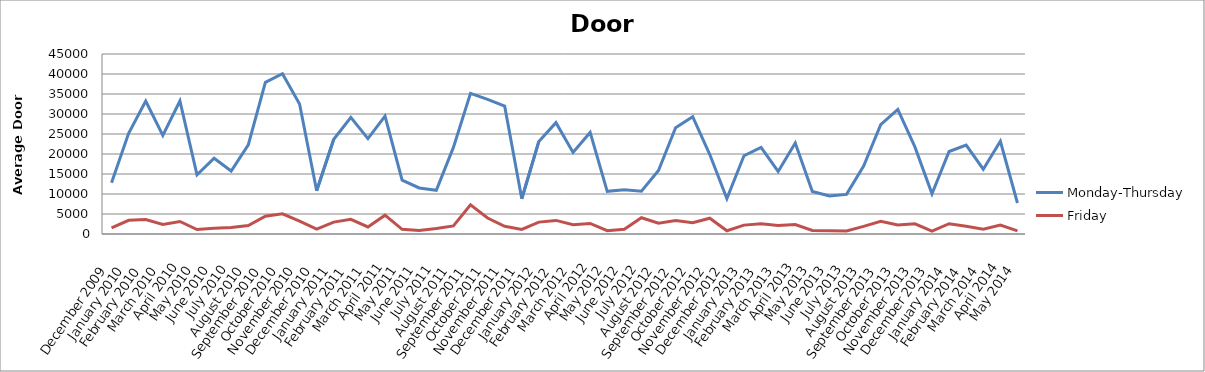
| Category | Monday-Thursday | Friday |
|---|---|---|
| December 2009 | 12794.08 | 1542.84 |
| January 2010 | 25183.6 | 3426.28 |
| February 2010 | 33229.04 | 3602.56 |
| March 2010 | 24653.2 | 2389.4 |
| April 2010 | 33251.4 | 3125.72 |
| May 2010 | 14776.84 | 1113.32 |
| June 2010 | 18934.76 | 1442.48 |
| July 2010 | 15737.28 | 1618.24 |
| August 2010 | 22301.24 | 2111.2 |
| September 2010 | 37928.28 | 4437.68 |
| October 2010 | 40062.36 | 5045.04 |
| November 2010 | 32506.76 | 3201.12 |
| December 2010 | 10798.84 | 1203.8 |
| January 2011 | 23665.72 | 2977 |
| February 2011 | 29174.08 | 3684.2 |
| March 2011 | 23840.96 | 1755 |
| April 2011 | 29448.64 | 4697.68 |
| May 2011 | 13457.6 | 1167.92 |
| June 2011 | 11518.52 | 848.64 |
| July 2011 | 10927.28 | 1373.32 |
| August 2011 | 21652.28 | 2016.04 |
| September 2011 | 35165 | 7283.64 |
| October 2011 | 33645.04 | 3995.16 |
| November 2011 | 31949.32 | 1914.64 |
| December 2011 | 8822.32 | 1140.88 |
| January 2012 | 23138.96 | 2971.8 |
| February 2012 | 27836.12 | 3397.16 |
| March 2012 | 20371 | 2331.68 |
| April 2012 | 25392.64 | 2635.36 |
| May 2012 | 10664.16 | 843.96 |
| June 2012 | 11031.8 | 1170 |
| July 2012 | 10674.56 | 4073.68 |
| August 2012 | 15888.6 | 2678 |
| September 2012 | 26550.16 | 3341.52 |
| October 2012 | 29338.4 | 2816.32 |
| November 2012 | 19865.04 | 3949.4 |
| December 2012 | 8835.32 | 809.64 |
| January 2013 | 19564.48 | 2219.36 |
| February 2013 | 21661.64 | 2578.16 |
| March 2013 | 15646.28 | 2096.12 |
| April 2013 | 22761.96 | 2379.52 |
| May 2013 | 10652.2 | 900.64 |
| June 2013 | 9501.96 | 809.64 |
| July 2013 | 9903.92 | 760.76 |
| August 2013 | 16986.32 | 1918.8 |
| September 2013 | 27335.36 | 3178.24 |
| October 2013 | 31147.48 | 2246.92 |
| November 2013 | 21774.48 | 2539.68 |
| December 2013 | 10033.92 | 693.16 |
| January 2014 | 20623.2 | 2579.72 |
| February 2014 | 22236.24 | 1914.12 |
| March 2014 | 16196.44 | 1202.76 |
| April 2014 | 23166 | 2222.48 |
| May 2014 | 7751.12 | 790.92 |